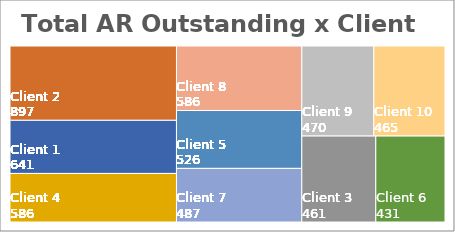
| Category | 0-30 | 30-60 | 60-90 | 90+ |
|---|---|---|---|---|
| % of total AR Outstanding | 0.335 | 0.166 | 0.238 | 0.261 |